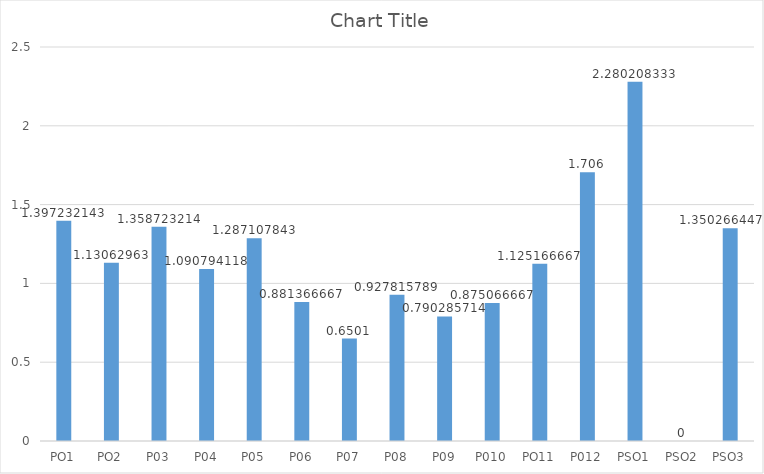
| Category | Series 0 |
|---|---|
| PO1 | 1.397 |
| PO2 | 1.131 |
| P03 | 1.359 |
| P04 | 1.091 |
| P05 | 1.287 |
| P06 | 0.881 |
| P07 | 0.65 |
| P08 | 0.928 |
| P09 | 0.79 |
| P010 | 0.875 |
| PO11 | 1.125 |
| P012 | 1.706 |
| PSO1 | 2.28 |
| PSO2 | 0 |
| PSO3 | 1.35 |